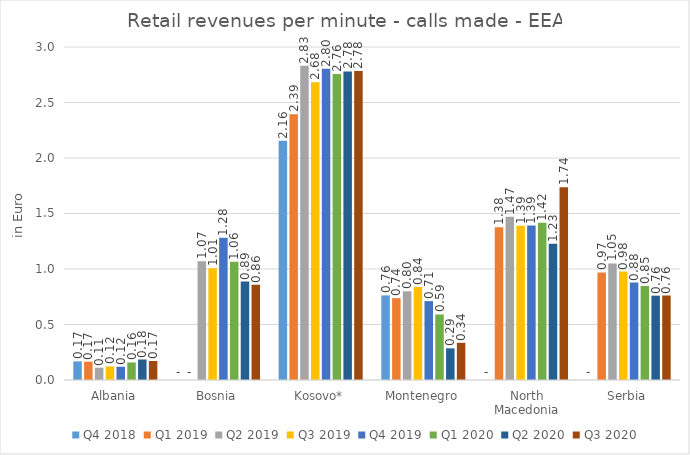
| Category | Q4 2018 | Q1 2019 | Q2 2019 | Q3 2019 | Q4 2019 | Q1 2020 | Q2 2020 | Q3 2020 |
|---|---|---|---|---|---|---|---|---|
| Albania | 0.168 | 0.165 | 0.111 | 0.122 | 0.119 | 0.158 | 0.185 | 0.171 |
| Bosnia | 0 | 0 | 1.07 | 1.006 | 1.283 | 1.065 | 0.887 | 0.857 |
| Kosovo* | 2.156 | 2.395 | 2.83 | 2.683 | 2.803 | 2.757 | 2.779 | 2.784 |
| Montenegro | 0.762 | 0.737 | 0.8 | 0.838 | 0.711 | 0.59 | 0.285 | 0.335 |
| North Macedonia | 0 | 1.377 | 1.47 | 1.389 | 1.392 | 1.416 | 1.228 | 1.737 |
| Serbia | 0 | 0.97 | 1.05 | 0.977 | 0.878 | 0.846 | 0.76 | 0.761 |